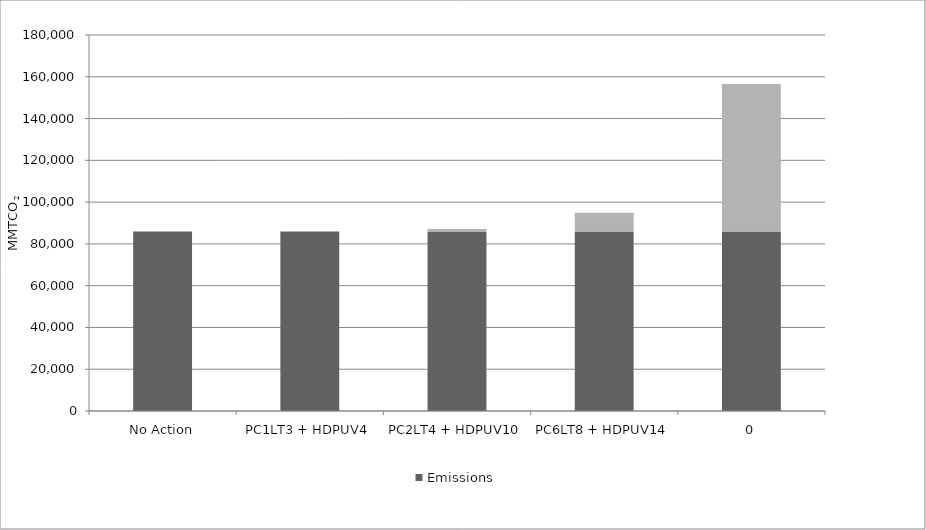
| Category | Emissions | Emissions Difference Compared to No Action Alternative |
|---|---|---|
| No Action | 85900 | 0 |
| PC1LT3 + HDPUV4 | 85900 | 300 |
| PC2LT4 + HDPUV10 | 85900 | 1200 |
| PC6LT8 + HDPUV14 | 85900 | 9000 |
| 0 | 85900 | 70600 |